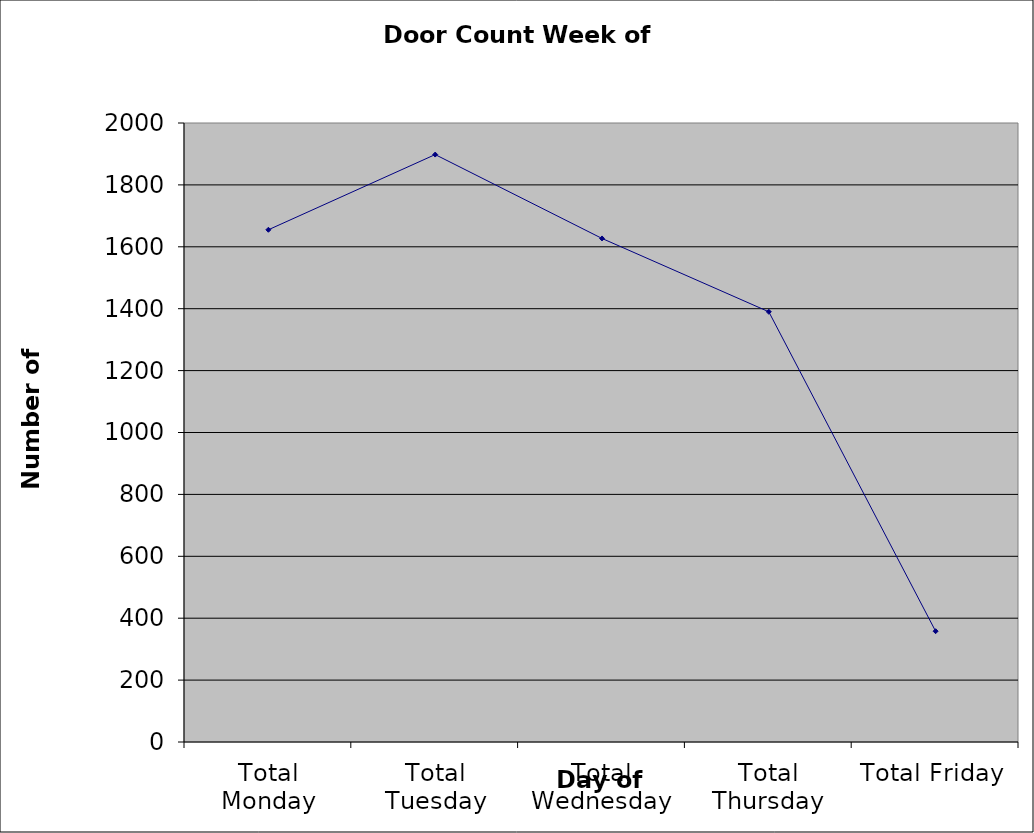
| Category | Series 0 |
|---|---|
| Total Monday | 1655 |
| Total Tuesday | 1898 |
| Total Wednesday | 1627 |
| Total Thursday | 1390 |
| Total Friday | 358 |